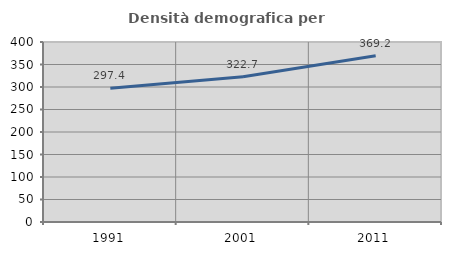
| Category | Densità demografica |
|---|---|
| 1991.0 | 297.394 |
| 2001.0 | 322.714 |
| 2011.0 | 369.211 |